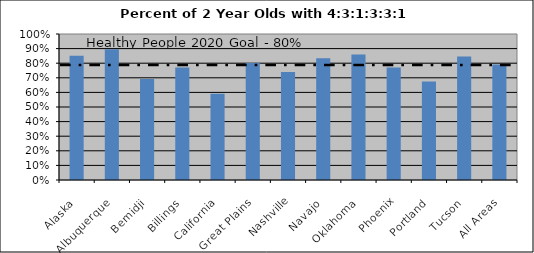
| Category | Percent with 4:3:1:3:3:1 |
|---|---|
| Alaska | 0.85 |
| Albuquerque | 0.896 |
| Bemidji | 0.692 |
| Billings | 0.77 |
| California | 0.591 |
| Great Plains | 0.801 |
| Nashville | 0.74 |
| Navajo | 0.833 |
| Oklahoma | 0.86 |
| Phoenix | 0.771 |
| Portland | 0.674 |
| Tucson | 0.845 |
| All Areas | 0.792 |